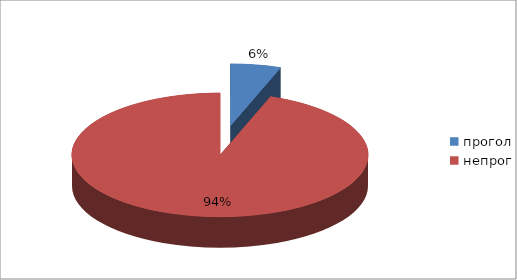
| Category | Series 0 |
|---|---|
| прогол | 27 |
| непрог | 463 |